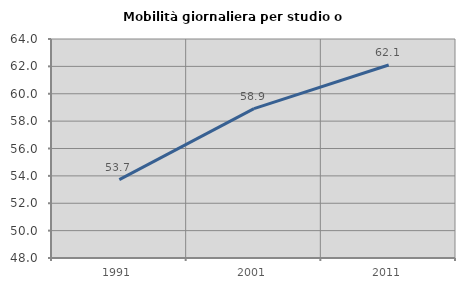
| Category | Mobilità giornaliera per studio o lavoro |
|---|---|
| 1991.0 | 53.728 |
| 2001.0 | 58.911 |
| 2011.0 | 62.097 |